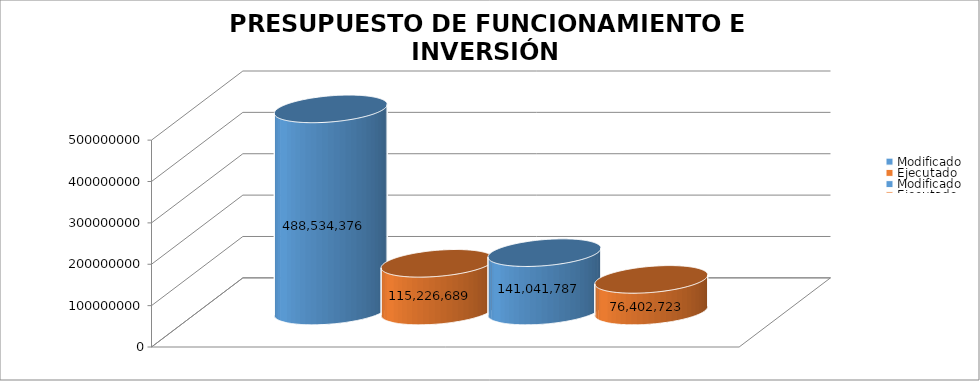
| Category | Modificado | Ejecutado | Series 2 |
|---|---|---|---|
| 0 | 141041787 | 76402723.28 |  |